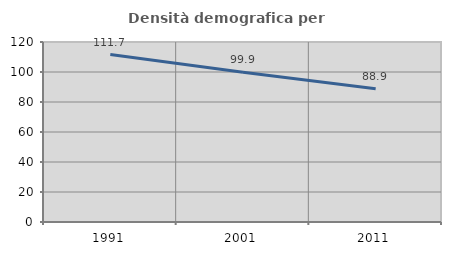
| Category | Densità demografica |
|---|---|
| 1991.0 | 111.652 |
| 2001.0 | 99.902 |
| 2011.0 | 88.852 |